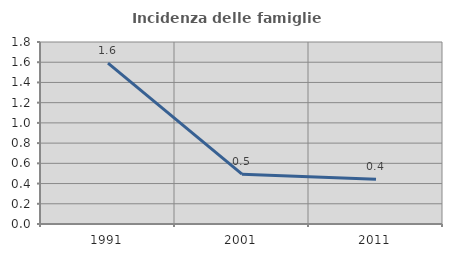
| Category | Incidenza delle famiglie numerose |
|---|---|
| 1991.0 | 1.591 |
| 2001.0 | 0.493 |
| 2011.0 | 0.441 |